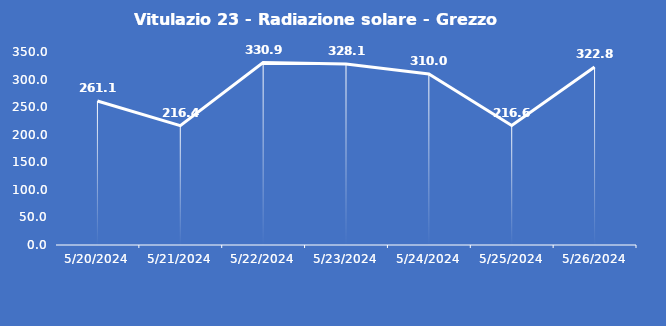
| Category | Vitulazio 23 - Radiazione solare - Grezzo (W/m2) |
|---|---|
| 5/20/24 | 261.1 |
| 5/21/24 | 216.4 |
| 5/22/24 | 330.9 |
| 5/23/24 | 328.1 |
| 5/24/24 | 310 |
| 5/25/24 | 216.6 |
| 5/26/24 | 322.8 |